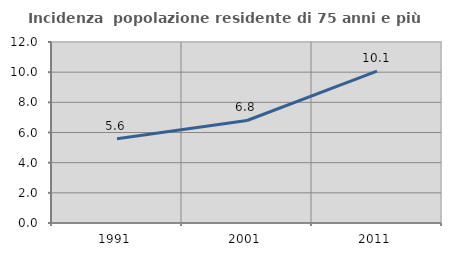
| Category | Incidenza  popolazione residente di 75 anni e più |
|---|---|
| 1991.0 | 5.589 |
| 2001.0 | 6.797 |
| 2011.0 | 10.067 |